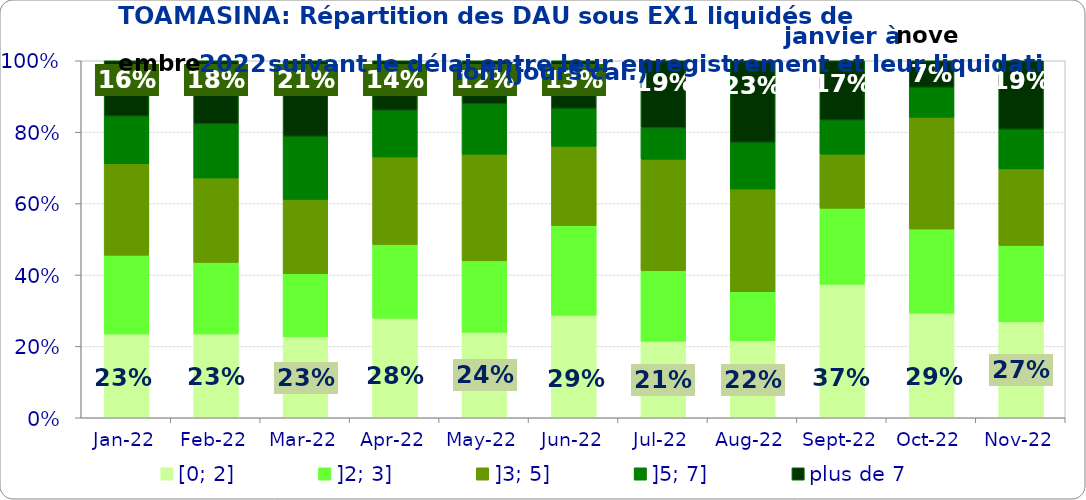
| Category | [0; 2] | ]2; 3] | ]3; 5] | ]5; 7] | plus de 7 |
|---|---|---|---|---|---|
| 2022-01-01 | 0.235 | 0.221 | 0.256 | 0.133 | 0.155 |
| 2022-02-01 | 0.235 | 0.2 | 0.236 | 0.152 | 0.177 |
| 2022-03-01 | 0.227 | 0.177 | 0.208 | 0.177 | 0.212 |
| 2022-04-01 | 0.278 | 0.207 | 0.245 | 0.131 | 0.138 |
| 2022-05-01 | 0.24 | 0.2 | 0.299 | 0.141 | 0.121 |
| 2022-06-01 | 0.287 | 0.251 | 0.222 | 0.106 | 0.134 |
| 2022-07-01 | 0.214 | 0.198 | 0.312 | 0.088 | 0.188 |
| 2022-08-01 | 0.216 | 0.137 | 0.288 | 0.131 | 0.228 |
| 2022-09-01 | 0.374 | 0.213 | 0.152 | 0.095 | 0.166 |
| 2022-10-01 | 0.293 | 0.236 | 0.313 | 0.084 | 0.075 |
| 2022-11-01 | 0.269 | 0.214 | 0.214 | 0.111 | 0.192 |